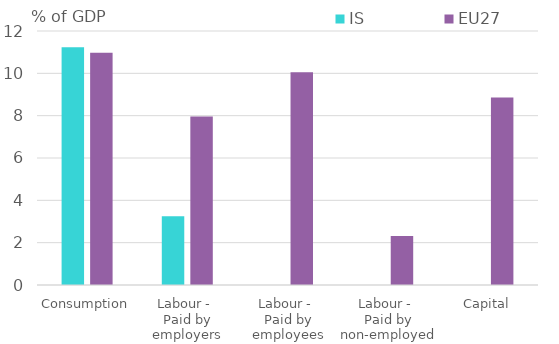
| Category | IS | EU27 |
|---|---|---|
| Consumption | 11.233 | 10.967 |
| Labour - 
Paid by employers | 3.244 | 7.966 |
| Labour - 
Paid by employees | 0 | 10.052 |
| Labour - 
Paid by non-employed | 0 | 2.311 |
| Capital | 0 | 8.858 |